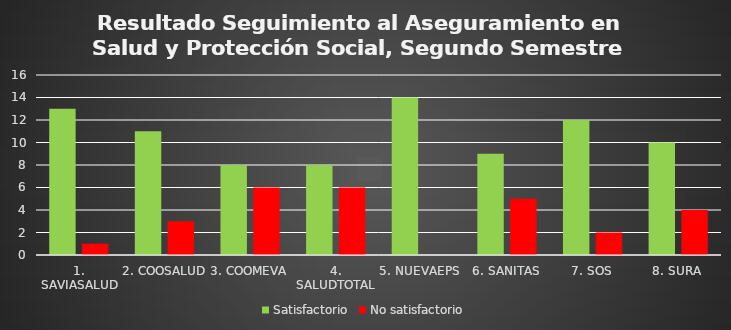
| Category | Satisfactorio | No satisfactorio |
|---|---|---|
| 1. SAVIASALUD | 13 | 1 |
| 2. COOSALUD | 11 | 3 |
| 3. COOMEVA | 8 | 6 |
| 4. SALUDTOTAL | 8 | 6 |
| 5. NUEVAEPS | 14 | 0 |
| 6. SANITAS | 9 | 5 |
| 7. SOS | 12 | 2 |
| 8. SURA | 10 | 4 |